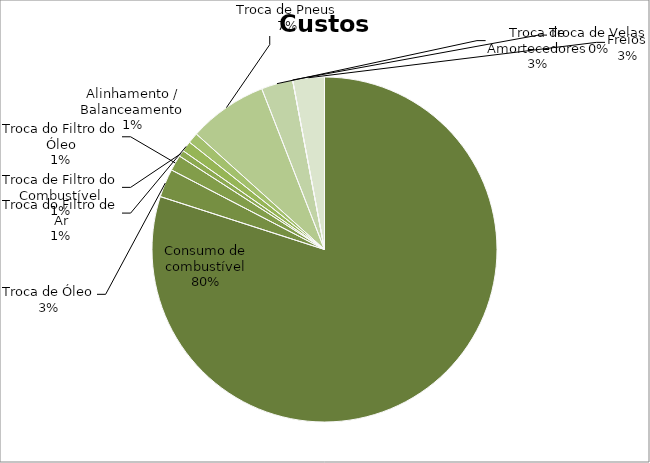
| Category | Series 0 |
|---|---|
| Consumo de combustível | 216 |
| Troca de Óleo | 7.2 |
| Troca do Filtro do Óleo | 4 |
| Troca de Filtro do Combustível | 1.6 |
| Troca do Filtro de Ar | 2.667 |
| Alinhamento / Balanceamento | 2.667 |
| Troca de Pneus | 20 |
| Troca de Amortecedores | 8 |
| Troca de Velas | 0 |
| Freios | 8 |